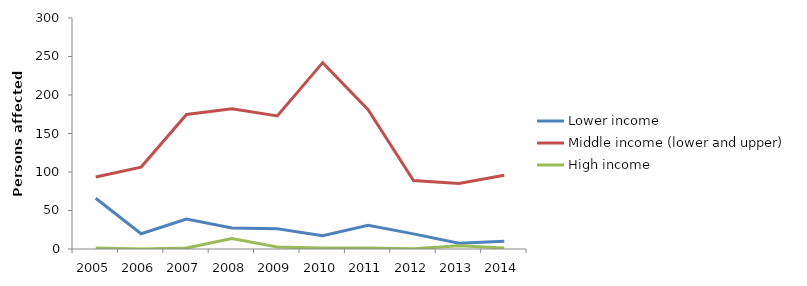
| Category | Lower income | Middle income (lower and upper) | High income |
|---|---|---|---|
| 2005.0 | 65.854 | 93.497 | 1.175 |
| 2006.0 | 19.801 | 106.36 | 0.142 |
| 2007.0 | 38.901 | 174.694 | 1.203 |
| 2008.0 | 27.21 | 182.082 | 13.505 |
| 2009.0 | 26.422 | 172.875 | 2.48 |
| 2010.0 | 17.124 | 242.056 | 1.204 |
| 2011.0 | 30.657 | 180.903 | 1.207 |
| 2012.0 | 19.64 | 88.975 | 0.373 |
| 2013.0 | 7.549 | 84.969 | 4.129 |
| 2014.0 | 10.213 | 95.728 | 1.401 |